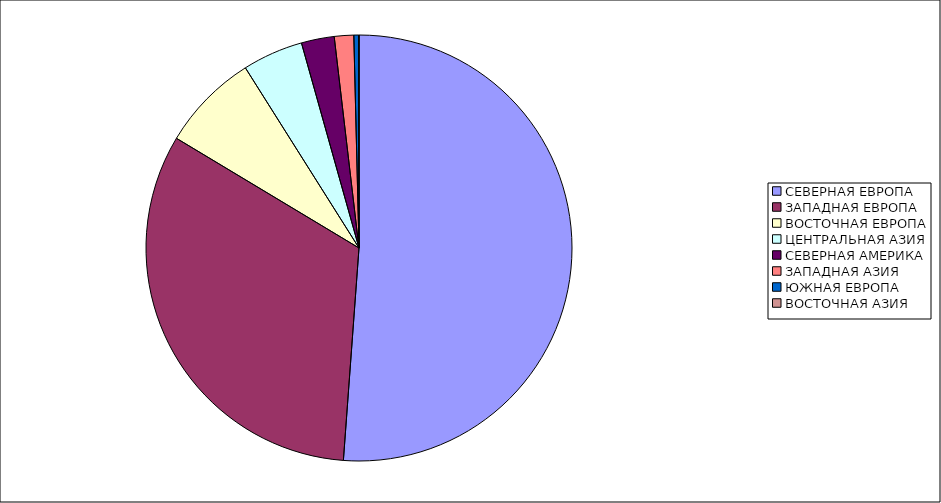
| Category | Оборот |
|---|---|
| СЕВЕРНАЯ ЕВРОПА | 51.168 |
| ЗАПАДНАЯ ЕВРОПА | 32.444 |
| ВОСТОЧНАЯ ЕВРОПА | 7.432 |
| ЦЕНТРАЛЬНАЯ АЗИЯ | 4.601 |
| СЕВЕРНАЯ АМЕРИКА | 2.495 |
| ЗАПАДНАЯ АЗИЯ | 1.471 |
| ЮЖНАЯ ЕВРОПА | 0.376 |
| ВОСТОЧНАЯ АЗИЯ | 0.012 |